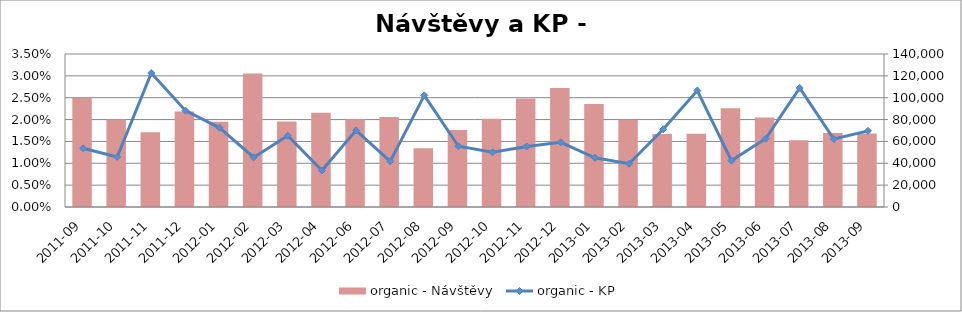
| Category | organic - Návštěvy |
|---|---|
| 2011-09 | 99656.743 |
| 2011-10 | 80064.502 |
| 2011-11 | 68371.3 |
| 2011-12 | 87449.295 |
| 2012-01 | 78103.012 |
| 2012-02 | 122182.865 |
| 2012-03 | 78205.523 |
| 2012-04 | 86218.631 |
| 2012-06 | 80377.725 |
| 2012-07 | 82380.738 |
| 2012-08 | 53687.037 |
| 2012-09 | 70470.322 |
| 2012-10 | 80811.046 |
| 2012-11 | 99236.507 |
| 2012-12 | 108978.765 |
| 2013-01 | 94297.805 |
| 2013-02 | 79799.251 |
| 2013-03 | 66704.643 |
| 2013-04 | 66959.511 |
| 2013-05 | 90304.187 |
| 2013-06 | 81793.447 |
| 2013-07 | 61163.218 |
| 2013-08 | 67628.705 |
| 2013-09 | 67254.796 |